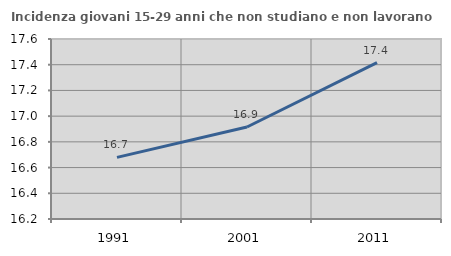
| Category | Incidenza giovani 15-29 anni che non studiano e non lavorano  |
|---|---|
| 1991.0 | 16.679 |
| 2001.0 | 16.915 |
| 2011.0 | 17.416 |